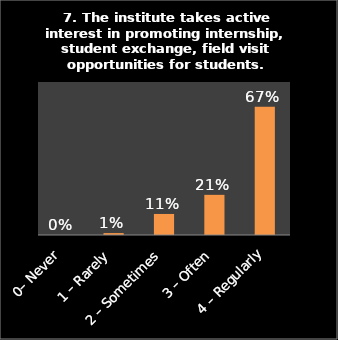
| Category | Series 0 |
|---|---|
| 0– Never | 0 |
| 1 – Rarely | 0.01 |
| 2 – Sometimes | 0.11 |
| 3 – Often | 0.21 |
| 4 – Regularly | 0.67 |